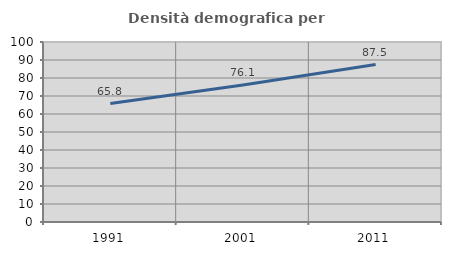
| Category | Densità demografica |
|---|---|
| 1991.0 | 65.784 |
| 2001.0 | 76.058 |
| 2011.0 | 87.461 |